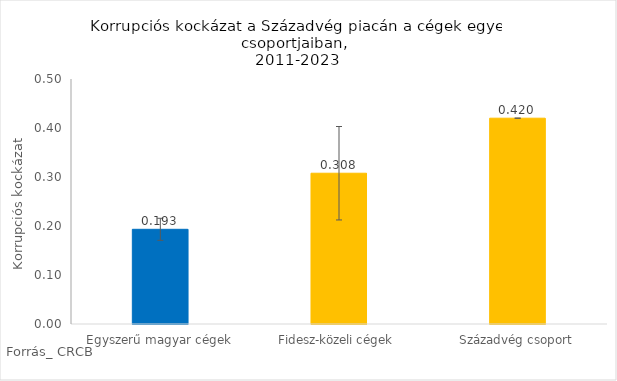
| Category | Series 0 |
|---|---|
| Egyszerű magyar cégek | 0.193 |
| Fidesz-közeli cégek | 0.308 |
| Századvég csoport | 0.42 |